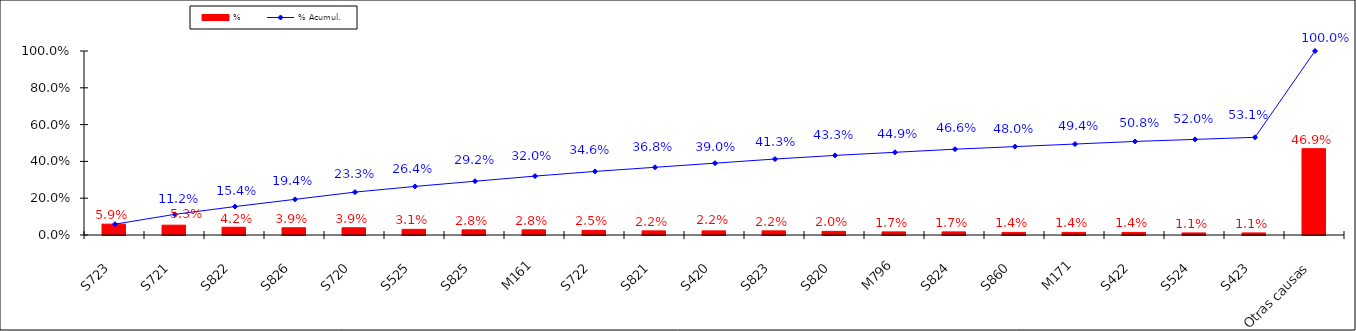
| Category | % |
|---|---|
| S723 | 0.059 |
| S721 | 0.053 |
| S822 | 0.042 |
| S826 | 0.039 |
| S720 | 0.039 |
| S525 | 0.031 |
| S825 | 0.028 |
| M161 | 0.028 |
| S722 | 0.025 |
| S821 | 0.022 |
| S420 | 0.022 |
| S823 | 0.022 |
| S820 | 0.02 |
| M796 | 0.017 |
| S824 | 0.017 |
| S860 | 0.014 |
| M171 | 0.014 |
| S422 | 0.014 |
| S524 | 0.011 |
| S423 | 0.011 |
| Otras causas | 0.469 |